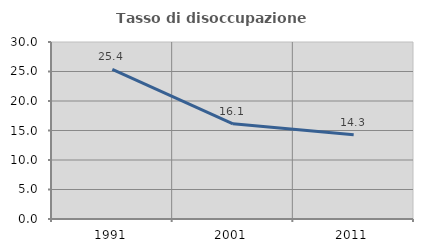
| Category | Tasso di disoccupazione giovanile  |
|---|---|
| 1991.0 | 25.373 |
| 2001.0 | 16.129 |
| 2011.0 | 14.286 |